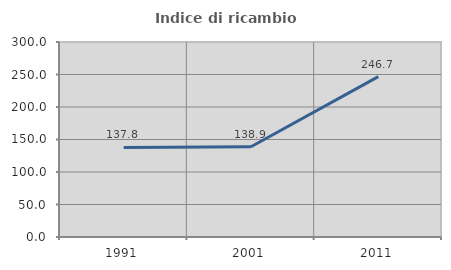
| Category | Indice di ricambio occupazionale  |
|---|---|
| 1991.0 | 137.838 |
| 2001.0 | 138.889 |
| 2011.0 | 246.667 |